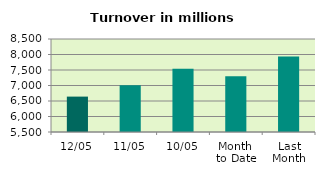
| Category | Series 0 |
|---|---|
| 12/05 | 6641.849 |
| 11/05 | 7010.287 |
| 10/05 | 7541.302 |
| Month 
to Date | 7298.452 |
| Last
Month | 7939.051 |